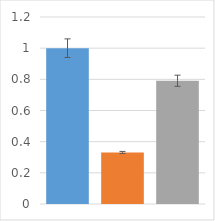
| Category | Series 0 |
|---|---|
| 0 | 1 |
| 1 | 0.331 |
| 2 | 0.791 |